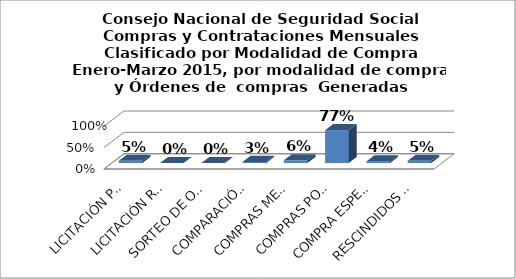
| Category | Series 0 |
|---|---|
| LICITACIÓN PÚBLICA | 0.051 |
| LICITACIÓN RESTRINGIDA | 0 |
| SORTEO DE OBRAS | 0 |
| COMPARACIÓN DE PRECIOS | 0.026 |
| COMPRAS MENORES | 0.064 |
| COMPRAS POR DEBAJO DEL UMBRAL MÍNIMO | 0.769 |
| COMPRA ESPECIAL RECURRENTE | 0.038 |
| RESCINDIDOS Y/O CANCELADOS | 0.051 |